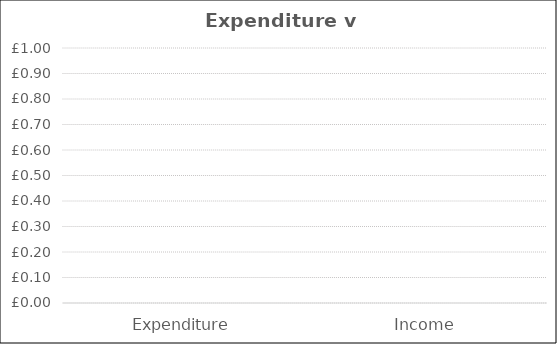
| Category | Series 0 |
|---|---|
| Expenditure | 0 |
| Income | 0 |